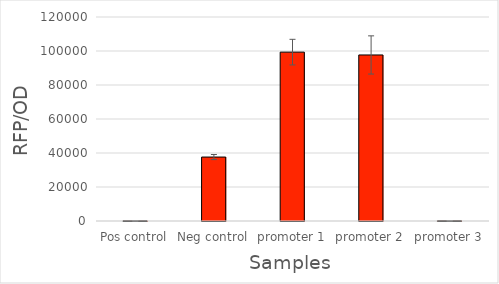
| Category | Series 0 |
|---|---|
| Pos control | 124.23 |
| Neg control | 37614.528 |
| promoter 1 | 99336.983 |
| promoter 2 | 97672.852 |
| promoter 3 | 152.631 |